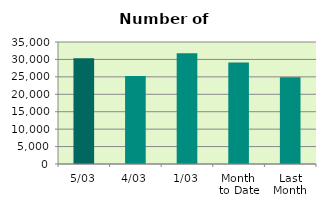
| Category | Series 0 |
|---|---|
| 5/03 | 30348 |
| 4/03 | 25226 |
| 1/03 | 31762 |
| Month 
to Date | 29112 |
| Last
Month | 24872.2 |